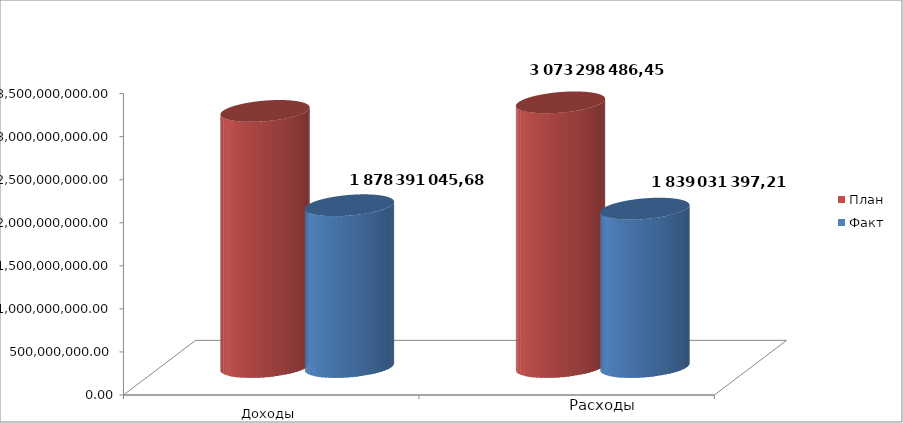
| Category | План | Факт |
|---|---|---|
| 0 | 2973876070.1 | 1878391045.68 |
| 1 | 3073298486.45 | 1839031397.21 |